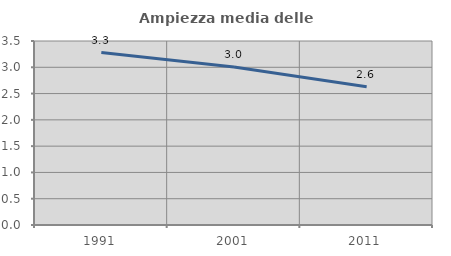
| Category | Ampiezza media delle famiglie |
|---|---|
| 1991.0 | 3.279 |
| 2001.0 | 3.007 |
| 2011.0 | 2.628 |